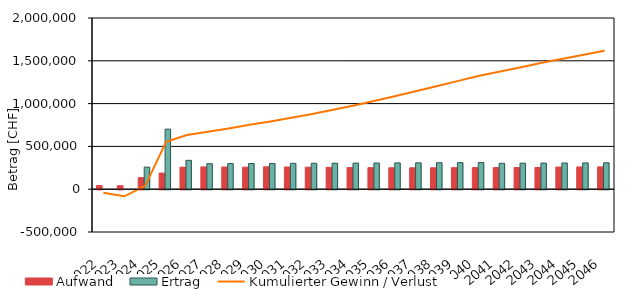
| Category | Aufwand | Ertrag |
|---|---|---|
| 2022.0 | 42400 | 0 |
| 2023.0 | 40907.333 | 0 |
| 2024.0 | 135165.746 | 258000.638 |
| 2025.0 | 188406.641 | 701395.176 |
| 2026.0 | 257051.653 | 337084.935 |
| 2027.0 | 260024.015 | 297856.034 |
| 2028.0 | 258966.877 | 298846.839 |
| 2029.0 | 257915.974 | 299847.74 |
| 2030.0 | 261671.366 | 300858.839 |
| 2031.0 | 259673.118 | 301880.238 |
| 2032.0 | 257681.292 | 302912.039 |
| 2033.0 | 255695.953 | 303954.348 |
| 2034.0 | 253717.166 | 305007.268 |
| 2035.0 | 251744.996 | 306070.905 |
| 2036.0 | 250739.51 | 307145.368 |
| 2037.0 | 249740.774 | 308230.764 |
| 2038.0 | 250415.522 | 309327.203 |
| 2039.0 | 251311.782 | 310434.795 |
| 2040.0 | 252000.371 | 311553.651 |
| 2041.0 | 252695.984 | 302683.884 |
| 2042.0 | 253398.692 | 303825.608 |
| 2043.0 | 254108.566 | 304978.938 |
| 2044.0 | 259229.477 | 306143.99 |
| 2045.0 | 259953.897 | 307320.881 |
| 2046.0 | 260685.699 | 308509.729 |